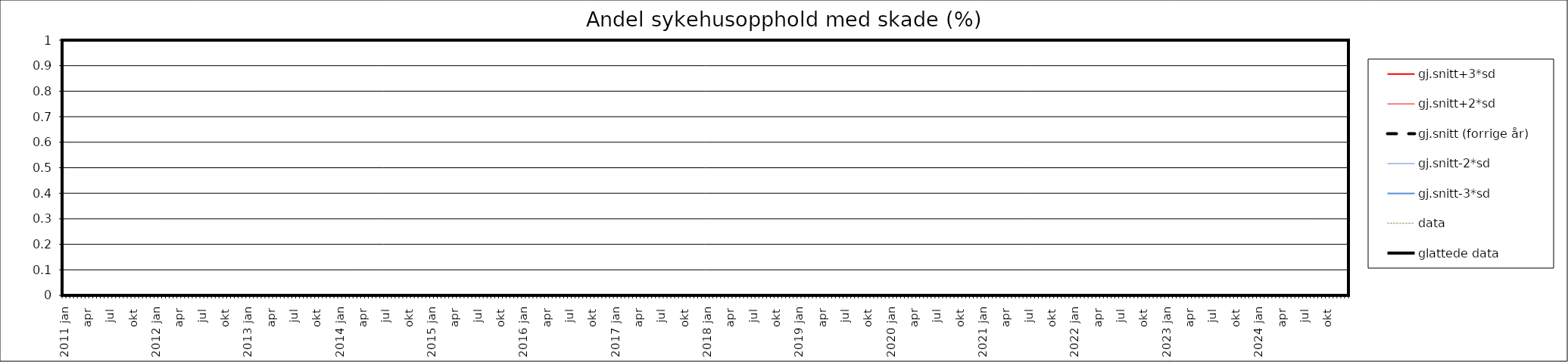
| Category | gj.snitt+3*sd | gj.snitt+2*sd | gj.snitt (forrige år) | gj.snitt-2*sd | gj.snitt-3*sd | data | glattede data |
|---|---|---|---|---|---|---|---|
| 2011 jan | 0 | 0 | 0 | 0 | 0 | 0 | 0 |
|  | 0 | 0 | 0 | 0 | 0 | 0 | 0 |
| feb | 0 | 0 | 0 | 0 | 0 | 0 | 0 |
|  | 0 | 0 | 0 | 0 | 0 | 0 | 0 |
| mar | 0 | 0 | 0 | 0 | 0 | 0 | 0 |
|  | 0 | 0 | 0 | 0 | 0 | 0 | 0 |
| apr | 0 | 0 | 0 | 0 | 0 | 0 | 0 |
|  | 0 | 0 | 0 | 0 | 0 | 0 | 0 |
| mai | 0 | 0 | 0 | 0 | 0 | 0 | 0 |
|  | 0 | 0 | 0 | 0 | 0 | 0 | 0 |
| jun | 0 | 0 | 0 | 0 | 0 | 0 | 0 |
|  | 0 | 0 | 0 | 0 | 0 | 0 | 0 |
| jul | 0 | 0 | 0 | 0 | 0 | 0 | 0 |
|  | 0 | 0 | 0 | 0 | 0 | 0 | 0 |
| aug | 0 | 0 | 0 | 0 | 0 | 0 | 0 |
|  | 0 | 0 | 0 | 0 | 0 | 0 | 0 |
| sep | 0 | 0 | 0 | 0 | 0 | 0 | 0 |
|  | 0 | 0 | 0 | 0 | 0 | 0 | 0 |
| okt | 0 | 0 | 0 | 0 | 0 | 0 | 0 |
|  | 0 | 0 | 0 | 0 | 0 | 0 | 0 |
| nov | 0 | 0 | 0 | 0 | 0 | 0 | 0 |
|  | 0 | 0 | 0 | 0 | 0 | 0 | 0 |
| des | 0 | 0 | 0 | 0 | 0 | 0 | 0 |
|  | 0 | 0 | 0 | 0 | 0 | 0 | 0 |
| 2012 jan | 0 | 0 | 0 | 0 | 0 | 0 | 0 |
|  | 0 | 0 | 0 | 0 | 0 | 0 | 0 |
| feb | 0 | 0 | 0 | 0 | 0 | 0 | 0 |
|  | 0 | 0 | 0 | 0 | 0 | 0 | 0 |
| mar | 0 | 0 | 0 | 0 | 0 | 0 | 0 |
|  | 0 | 0 | 0 | 0 | 0 | 0 | 0 |
| apr | 0 | 0 | 0 | 0 | 0 | 0 | 0 |
|  | 0 | 0 | 0 | 0 | 0 | 0 | 0 |
| mai | 0 | 0 | 0 | 0 | 0 | 0 | 0 |
|  | 0 | 0 | 0 | 0 | 0 | 0 | 0 |
| jun | 0 | 0 | 0 | 0 | 0 | 0 | 0 |
|  | 0 | 0 | 0 | 0 | 0 | 0 | 0 |
| jul | 0 | 0 | 0 | 0 | 0 | 0 | 0 |
|  | 0 | 0 | 0 | 0 | 0 | 0 | 0 |
| aug | 0 | 0 | 0 | 0 | 0 | 0 | 0 |
|  | 0 | 0 | 0 | 0 | 0 | 0 | 0 |
| sep | 0 | 0 | 0 | 0 | 0 | 0 | 0 |
|  | 0 | 0 | 0 | 0 | 0 | 0 | 0 |
| okt | 0 | 0 | 0 | 0 | 0 | 0 | 0 |
|  | 0 | 0 | 0 | 0 | 0 | 0 | 0 |
| nov | 0 | 0 | 0 | 0 | 0 | 0 | 0 |
|  | 0 | 0 | 0 | 0 | 0 | 0 | 0 |
| des | 0 | 0 | 0 | 0 | 0 | 0 | 0 |
|  | 0 | 0 | 0 | 0 | 0 | 0 | 0 |
| 2013 jan | 0 | 0 | 0 | 0 | 0 | 0 | 0 |
|  | 0 | 0 | 0 | 0 | 0 | 0 | 0 |
| feb | 0 | 0 | 0 | 0 | 0 | 0 | 0 |
|  | 0 | 0 | 0 | 0 | 0 | 0 | 0 |
| mar | 0 | 0 | 0 | 0 | 0 | 0 | 0 |
|  | 0 | 0 | 0 | 0 | 0 | 0 | 0 |
| apr | 0 | 0 | 0 | 0 | 0 | 0 | 0 |
|  | 0 | 0 | 0 | 0 | 0 | 0 | 0 |
| mai | 0 | 0 | 0 | 0 | 0 | 0 | 0 |
|  | 0 | 0 | 0 | 0 | 0 | 0 | 0 |
| jun | 0 | 0 | 0 | 0 | 0 | 0 | 0 |
|  | 0 | 0 | 0 | 0 | 0 | 0 | 0 |
| jul | 0 | 0 | 0 | 0 | 0 | 0 | 0 |
|  | 0 | 0 | 0 | 0 | 0 | 0 | 0 |
| aug | 0 | 0 | 0 | 0 | 0 | 0 | 0 |
|  | 0 | 0 | 0 | 0 | 0 | 0 | 0 |
| sep | 0 | 0 | 0 | 0 | 0 | 0 | 0 |
|  | 0 | 0 | 0 | 0 | 0 | 0 | 0 |
| okt | 0 | 0 | 0 | 0 | 0 | 0 | 0 |
|  | 0 | 0 | 0 | 0 | 0 | 0 | 0 |
| nov | 0 | 0 | 0 | 0 | 0 | 0 | 0 |
|  | 0 | 0 | 0 | 0 | 0 | 0 | 0 |
| des | 0 | 0 | 0 | 0 | 0 | 0 | 0 |
|  | 0 | 0 | 0 | 0 | 0 | 0 | 0 |
| 2014 jan | 0 | 0 | 0 | 0 | 0 | 0 | 0 |
|  | 0 | 0 | 0 | 0 | 0 | 0 | 0 |
| feb | 0 | 0 | 0 | 0 | 0 | 0 | 0 |
|  | 0 | 0 | 0 | 0 | 0 | 0 | 0 |
| mar | 0 | 0 | 0 | 0 | 0 | 0 | 0 |
|  | 0 | 0 | 0 | 0 | 0 | 0 | 0 |
| apr | 0 | 0 | 0 | 0 | 0 | 0 | 0 |
|  | 0 | 0 | 0 | 0 | 0 | 0 | 0 |
| mai | 0 | 0 | 0 | 0 | 0 | 0 | 0 |
|  | 0 | 0 | 0 | 0 | 0 | 0 | 0 |
| jun | 0 | 0 | 0 | 0 | 0 | 0 | 0 |
|  | 0 | 0 | 0 | 0 | 0 | 0 | 0 |
| jul | 0 | 0 | 0 | 0 | 0 | 0 | 0 |
|  | 0 | 0 | 0 | 0 | 0 | 0 | 0 |
| aug | 0 | 0 | 0 | 0 | 0 | 0 | 0 |
|  | 0 | 0 | 0 | 0 | 0 | 0 | 0 |
| sep | 0 | 0 | 0 | 0 | 0 | 0 | 0 |
|  | 0 | 0 | 0 | 0 | 0 | 0 | 0 |
| okt | 0 | 0 | 0 | 0 | 0 | 0 | 0 |
|  | 0 | 0 | 0 | 0 | 0 | 0 | 0 |
| nov | 0 | 0 | 0 | 0 | 0 | 0 | 0 |
|  | 0 | 0 | 0 | 0 | 0 | 0 | 0 |
| des | 0 | 0 | 0 | 0 | 0 | 0 | 0 |
|  | 0 | 0 | 0 | 0 | 0 | 0 | 0 |
| 2015 jan | 0 | 0 | 0 | 0 | 0 | 0 | 0 |
|  | 0 | 0 | 0 | 0 | 0 | 0 | 0 |
| feb | 0 | 0 | 0 | 0 | 0 | 0 | 0 |
|  | 0 | 0 | 0 | 0 | 0 | 0 | 0 |
| mar | 0 | 0 | 0 | 0 | 0 | 0 | 0 |
|  | 0 | 0 | 0 | 0 | 0 | 0 | 0 |
| apr | 0 | 0 | 0 | 0 | 0 | 0 | 0 |
|  | 0 | 0 | 0 | 0 | 0 | 0 | 0 |
| mai | 0 | 0 | 0 | 0 | 0 | 0 | 0 |
|  | 0 | 0 | 0 | 0 | 0 | 0 | 0 |
| jun | 0 | 0 | 0 | 0 | 0 | 0 | 0 |
|  | 0 | 0 | 0 | 0 | 0 | 0 | 0 |
| jul | 0 | 0 | 0 | 0 | 0 | 0 | 0 |
|  | 0 | 0 | 0 | 0 | 0 | 0 | 0 |
| aug | 0 | 0 | 0 | 0 | 0 | 0 | 0 |
|  | 0 | 0 | 0 | 0 | 0 | 0 | 0 |
| sep | 0 | 0 | 0 | 0 | 0 | 0 | 0 |
|  | 0 | 0 | 0 | 0 | 0 | 0 | 0 |
| okt | 0 | 0 | 0 | 0 | 0 | 0 | 0 |
|  | 0 | 0 | 0 | 0 | 0 | 0 | 0 |
| nov | 0 | 0 | 0 | 0 | 0 | 0 | 0 |
|  | 0 | 0 | 0 | 0 | 0 | 0 | 0 |
| des | 0 | 0 | 0 | 0 | 0 | 0 | 0 |
|  | 0 | 0 | 0 | 0 | 0 | 0 | 0 |
| 2016 jan | 0 | 0 | 0 | 0 | 0 | 0 | 0 |
|  | 0 | 0 | 0 | 0 | 0 | 0 | 0 |
| feb | 0 | 0 | 0 | 0 | 0 | 0 | 0 |
|  | 0 | 0 | 0 | 0 | 0 | 0 | 0 |
| mar | 0 | 0 | 0 | 0 | 0 | 0 | 0 |
|  | 0 | 0 | 0 | 0 | 0 | 0 | 0 |
| apr | 0 | 0 | 0 | 0 | 0 | 0 | 0 |
|  | 0 | 0 | 0 | 0 | 0 | 0 | 0 |
| mai | 0 | 0 | 0 | 0 | 0 | 0 | 0 |
|  | 0 | 0 | 0 | 0 | 0 | 0 | 0 |
| jun | 0 | 0 | 0 | 0 | 0 | 0 | 0 |
|  | 0 | 0 | 0 | 0 | 0 | 0 | 0 |
| jul | 0 | 0 | 0 | 0 | 0 | 0 | 0 |
|  | 0 | 0 | 0 | 0 | 0 | 0 | 0 |
| aug | 0 | 0 | 0 | 0 | 0 | 0 | 0 |
|  | 0 | 0 | 0 | 0 | 0 | 0 | 0 |
| sep | 0 | 0 | 0 | 0 | 0 | 0 | 0 |
|  | 0 | 0 | 0 | 0 | 0 | 0 | 0 |
| okt | 0 | 0 | 0 | 0 | 0 | 0 | 0 |
|  | 0 | 0 | 0 | 0 | 0 | 0 | 0 |
| nov | 0 | 0 | 0 | 0 | 0 | 0 | 0 |
|  | 0 | 0 | 0 | 0 | 0 | 0 | 0 |
| des | 0 | 0 | 0 | 0 | 0 | 0 | 0 |
|  | 0 | 0 | 0 | 0 | 0 | 0 | 0 |
| 2017 jan | 0 | 0 | 0 | 0 | 0 | 0 | 0 |
|  | 0 | 0 | 0 | 0 | 0 | 0 | 0 |
| feb | 0 | 0 | 0 | 0 | 0 | 0 | 0 |
|  | 0 | 0 | 0 | 0 | 0 | 0 | 0 |
| mar | 0 | 0 | 0 | 0 | 0 | 0 | 0 |
|  | 0 | 0 | 0 | 0 | 0 | 0 | 0 |
| apr | 0 | 0 | 0 | 0 | 0 | 0 | 0 |
|  | 0 | 0 | 0 | 0 | 0 | 0 | 0 |
| mai | 0 | 0 | 0 | 0 | 0 | 0 | 0 |
|  | 0 | 0 | 0 | 0 | 0 | 0 | 0 |
| jun | 0 | 0 | 0 | 0 | 0 | 0 | 0 |
|  | 0 | 0 | 0 | 0 | 0 | 0 | 0 |
| jul | 0 | 0 | 0 | 0 | 0 | 0 | 0 |
|  | 0 | 0 | 0 | 0 | 0 | 0 | 0 |
| aug | 0 | 0 | 0 | 0 | 0 | 0 | 0 |
|  | 0 | 0 | 0 | 0 | 0 | 0 | 0 |
| sep | 0 | 0 | 0 | 0 | 0 | 0 | 0 |
|  | 0 | 0 | 0 | 0 | 0 | 0 | 0 |
| okt | 0 | 0 | 0 | 0 | 0 | 0 | 0 |
|  | 0 | 0 | 0 | 0 | 0 | 0 | 0 |
| nov | 0 | 0 | 0 | 0 | 0 | 0 | 0 |
|  | 0 | 0 | 0 | 0 | 0 | 0 | 0 |
| des | 0 | 0 | 0 | 0 | 0 | 0 | 0 |
|  | 0 | 0 | 0 | 0 | 0 | 0 | 0 |
| 2018 jan | 0 | 0 | 0 | 0 | 0 | 0 | 0 |
|  | 0 | 0 | 0 | 0 | 0 | 0 | 0 |
| feb | 0 | 0 | 0 | 0 | 0 | 0 | 0 |
|  | 0 | 0 | 0 | 0 | 0 | 0 | 0 |
| mar | 0 | 0 | 0 | 0 | 0 | 0 | 0 |
|  | 0 | 0 | 0 | 0 | 0 | 0 | 0 |
| apr | 0 | 0 | 0 | 0 | 0 | 0 | 0 |
|  | 0 | 0 | 0 | 0 | 0 | 0 | 0 |
| mai | 0 | 0 | 0 | 0 | 0 | 0 | 0 |
|  | 0 | 0 | 0 | 0 | 0 | 0 | 0 |
| jun | 0 | 0 | 0 | 0 | 0 | 0 | 0 |
|  | 0 | 0 | 0 | 0 | 0 | 0 | 0 |
| jul | 0 | 0 | 0 | 0 | 0 | 0 | 0 |
|  | 0 | 0 | 0 | 0 | 0 | 0 | 0 |
| aug | 0 | 0 | 0 | 0 | 0 | 0 | 0 |
|  | 0 | 0 | 0 | 0 | 0 | 0 | 0 |
| sep | 0 | 0 | 0 | 0 | 0 | 0 | 0 |
|  | 0 | 0 | 0 | 0 | 0 | 0 | 0 |
| okt | 0 | 0 | 0 | 0 | 0 | 0 | 0 |
|  | 0 | 0 | 0 | 0 | 0 | 0 | 0 |
| nov | 0 | 0 | 0 | 0 | 0 | 0 | 0 |
|  | 0 | 0 | 0 | 0 | 0 | 0 | 0 |
| des | 0 | 0 | 0 | 0 | 0 | 0 | 0 |
|  | 0 | 0 | 0 | 0 | 0 | 0 | 0 |
| 2019 jan | 0 | 0 | 0 | 0 | 0 | 0 | 0 |
|  | 0 | 0 | 0 | 0 | 0 | 0 | 0 |
| feb | 0 | 0 | 0 | 0 | 0 | 0 | 0 |
|  | 0 | 0 | 0 | 0 | 0 | 0 | 0 |
| mar | 0 | 0 | 0 | 0 | 0 | 0 | 0 |
|  | 0 | 0 | 0 | 0 | 0 | 0 | 0 |
| apr | 0 | 0 | 0 | 0 | 0 | 0 | 0 |
|  | 0 | 0 | 0 | 0 | 0 | 0 | 0 |
| mai | 0 | 0 | 0 | 0 | 0 | 0 | 0 |
|  | 0 | 0 | 0 | 0 | 0 | 0 | 0 |
| jun | 0 | 0 | 0 | 0 | 0 | 0 | 0 |
|  | 0 | 0 | 0 | 0 | 0 | 0 | 0 |
| jul | 0 | 0 | 0 | 0 | 0 | 0 | 0 |
|  | 0 | 0 | 0 | 0 | 0 | 0 | 0 |
| aug | 0 | 0 | 0 | 0 | 0 | 0 | 0 |
|  | 0 | 0 | 0 | 0 | 0 | 0 | 0 |
| sep | 0 | 0 | 0 | 0 | 0 | 0 | 0 |
|  | 0 | 0 | 0 | 0 | 0 | 0 | 0 |
| okt | 0 | 0 | 0 | 0 | 0 | 0 | 0 |
|  | 0 | 0 | 0 | 0 | 0 | 0 | 0 |
| nov | 0 | 0 | 0 | 0 | 0 | 0 | 0 |
|  | 0 | 0 | 0 | 0 | 0 | 0 | 0 |
| des | 0 | 0 | 0 | 0 | 0 | 0 | 0 |
|  | 0 | 0 | 0 | 0 | 0 | 0 | 0 |
| 2020 jan | 0 | 0 | 0 | 0 | 0 | 0 | 0 |
|  | 0 | 0 | 0 | 0 | 0 | 0 | 0 |
| feb | 0 | 0 | 0 | 0 | 0 | 0 | 0 |
|  | 0 | 0 | 0 | 0 | 0 | 0 | 0 |
| mar | 0 | 0 | 0 | 0 | 0 | 0 | 0 |
|  | 0 | 0 | 0 | 0 | 0 | 0 | 0 |
| apr | 0 | 0 | 0 | 0 | 0 | 0 | 0 |
|  | 0 | 0 | 0 | 0 | 0 | 0 | 0 |
| mai | 0 | 0 | 0 | 0 | 0 | 0 | 0 |
|  | 0 | 0 | 0 | 0 | 0 | 0 | 0 |
| jun | 0 | 0 | 0 | 0 | 0 | 0 | 0 |
|  | 0 | 0 | 0 | 0 | 0 | 0 | 0 |
| jul | 0 | 0 | 0 | 0 | 0 | 0 | 0 |
|  | 0 | 0 | 0 | 0 | 0 | 0 | 0 |
| aug | 0 | 0 | 0 | 0 | 0 | 0 | 0 |
|  | 0 | 0 | 0 | 0 | 0 | 0 | 0 |
| sep | 0 | 0 | 0 | 0 | 0 | 0 | 0 |
|  | 0 | 0 | 0 | 0 | 0 | 0 | 0 |
| okt | 0 | 0 | 0 | 0 | 0 | 0 | 0 |
|  | 0 | 0 | 0 | 0 | 0 | 0 | 0 |
| nov | 0 | 0 | 0 | 0 | 0 | 0 | 0 |
|  | 0 | 0 | 0 | 0 | 0 | 0 | 0 |
| des | 0 | 0 | 0 | 0 | 0 | 0 | 0 |
|  | 0 | 0 | 0 | 0 | 0 | 0 | 0 |
| 2021 jan | 0 | 0 | 0 | 0 | 0 | 0 | 0 |
|  | 0 | 0 | 0 | 0 | 0 | 0 | 0 |
| feb | 0 | 0 | 0 | 0 | 0 | 0 | 0 |
|  | 0 | 0 | 0 | 0 | 0 | 0 | 0 |
| mar | 0 | 0 | 0 | 0 | 0 | 0 | 0 |
|  | 0 | 0 | 0 | 0 | 0 | 0 | 0 |
| apr | 0 | 0 | 0 | 0 | 0 | 0 | 0 |
|  | 0 | 0 | 0 | 0 | 0 | 0 | 0 |
| mai | 0 | 0 | 0 | 0 | 0 | 0 | 0 |
|  | 0 | 0 | 0 | 0 | 0 | 0 | 0 |
| jun | 0 | 0 | 0 | 0 | 0 | 0 | 0 |
|  | 0 | 0 | 0 | 0 | 0 | 0 | 0 |
| jul | 0 | 0 | 0 | 0 | 0 | 0 | 0 |
|  | 0 | 0 | 0 | 0 | 0 | 0 | 0 |
| aug | 0 | 0 | 0 | 0 | 0 | 0 | 0 |
|  | 0 | 0 | 0 | 0 | 0 | 0 | 0 |
| sep | 0 | 0 | 0 | 0 | 0 | 0 | 0 |
|  | 0 | 0 | 0 | 0 | 0 | 0 | 0 |
| okt | 0 | 0 | 0 | 0 | 0 | 0 | 0 |
|  | 0 | 0 | 0 | 0 | 0 | 0 | 0 |
| nov | 0 | 0 | 0 | 0 | 0 | 0 | 0 |
|  | 0 | 0 | 0 | 0 | 0 | 0 | 0 |
| des | 0 | 0 | 0 | 0 | 0 | 0 | 0 |
|  | 0 | 0 | 0 | 0 | 0 | 0 | 0 |
| 2022 jan | 0 | 0 | 0 | 0 | 0 | 0 | 0 |
|  | 0 | 0 | 0 | 0 | 0 | 0 | 0 |
| feb | 0 | 0 | 0 | 0 | 0 | 0 | 0 |
|  | 0 | 0 | 0 | 0 | 0 | 0 | 0 |
| mar | 0 | 0 | 0 | 0 | 0 | 0 | 0 |
|  | 0 | 0 | 0 | 0 | 0 | 0 | 0 |
| apr | 0 | 0 | 0 | 0 | 0 | 0 | 0 |
|  | 0 | 0 | 0 | 0 | 0 | 0 | 0 |
| mai | 0 | 0 | 0 | 0 | 0 | 0 | 0 |
|  | 0 | 0 | 0 | 0 | 0 | 0 | 0 |
| jun | 0 | 0 | 0 | 0 | 0 | 0 | 0 |
|  | 0 | 0 | 0 | 0 | 0 | 0 | 0 |
| jul | 0 | 0 | 0 | 0 | 0 | 0 | 0 |
|  | 0 | 0 | 0 | 0 | 0 | 0 | 0 |
| aug | 0 | 0 | 0 | 0 | 0 | 0 | 0 |
|  | 0 | 0 | 0 | 0 | 0 | 0 | 0 |
| sep | 0 | 0 | 0 | 0 | 0 | 0 | 0 |
|  | 0 | 0 | 0 | 0 | 0 | 0 | 0 |
| okt | 0 | 0 | 0 | 0 | 0 | 0 | 0 |
|  | 0 | 0 | 0 | 0 | 0 | 0 | 0 |
| nov | 0 | 0 | 0 | 0 | 0 | 0 | 0 |
|  | 0 | 0 | 0 | 0 | 0 | 0 | 0 |
| des | 0 | 0 | 0 | 0 | 0 | 0 | 0 |
|  | 0 | 0 | 0 | 0 | 0 | 0 | 0 |
| 2023 jan | 0 | 0 | 0 | 0 | 0 | 0 | 0 |
|  | 0 | 0 | 0 | 0 | 0 | 0 | 0 |
| feb | 0 | 0 | 0 | 0 | 0 | 0 | 0 |
|  | 0 | 0 | 0 | 0 | 0 | 0 | 0 |
| mar | 0 | 0 | 0 | 0 | 0 | 0 | 0 |
|  | 0 | 0 | 0 | 0 | 0 | 0 | 0 |
| apr | 0 | 0 | 0 | 0 | 0 | 0 | 0 |
|  | 0 | 0 | 0 | 0 | 0 | 0 | 0 |
| mai | 0 | 0 | 0 | 0 | 0 | 0 | 0 |
|  | 0 | 0 | 0 | 0 | 0 | 0 | 0 |
| jun | 0 | 0 | 0 | 0 | 0 | 0 | 0 |
|  | 0 | 0 | 0 | 0 | 0 | 0 | 0 |
| jul | 0 | 0 | 0 | 0 | 0 | 0 | 0 |
|  | 0 | 0 | 0 | 0 | 0 | 0 | 0 |
| aug | 0 | 0 | 0 | 0 | 0 | 0 | 0 |
|  | 0 | 0 | 0 | 0 | 0 | 0 | 0 |
| sep | 0 | 0 | 0 | 0 | 0 | 0 | 0 |
|  | 0 | 0 | 0 | 0 | 0 | 0 | 0 |
| okt | 0 | 0 | 0 | 0 | 0 | 0 | 0 |
|  | 0 | 0 | 0 | 0 | 0 | 0 | 0 |
| nov | 0 | 0 | 0 | 0 | 0 | 0 | 0 |
|  | 0 | 0 | 0 | 0 | 0 | 0 | 0 |
| des | 0 | 0 | 0 | 0 | 0 | 0 | 0 |
|  | 0 | 0 | 0 | 0 | 0 | 0 | 0 |
| 2024 jan | 0 | 0 | 0 | 0 | 0 | 0 | 0 |
|  | 0 | 0 | 0 | 0 | 0 | 0 | 0 |
| feb | 0 | 0 | 0 | 0 | 0 | 0 | 0 |
|  | 0 | 0 | 0 | 0 | 0 | 0 | 0 |
| mar | 0 | 0 | 0 | 0 | 0 | 0 | 0 |
|  | 0 | 0 | 0 | 0 | 0 | 0 | 0 |
| apr | 0 | 0 | 0 | 0 | 0 | 0 | 0 |
|  | 0 | 0 | 0 | 0 | 0 | 0 | 0 |
| mai | 0 | 0 | 0 | 0 | 0 | 0 | 0 |
|  | 0 | 0 | 0 | 0 | 0 | 0 | 0 |
| jun | 0 | 0 | 0 | 0 | 0 | 0 | 0 |
|  | 0 | 0 | 0 | 0 | 0 | 0 | 0 |
| jul | 0 | 0 | 0 | 0 | 0 | 0 | 0 |
|  | 0 | 0 | 0 | 0 | 0 | 0 | 0 |
| aug | 0 | 0 | 0 | 0 | 0 | 0 | 0 |
|  | 0 | 0 | 0 | 0 | 0 | 0 | 0 |
| sep | 0 | 0 | 0 | 0 | 0 | 0 | 0 |
|  | 0 | 0 | 0 | 0 | 0 | 0 | 0 |
| okt | 0 | 0 | 0 | 0 | 0 | 0 | 0 |
|  | 0 | 0 | 0 | 0 | 0 | 0 | 0 |
| nov | 0 | 0 | 0 | 0 | 0 | 0 | 0 |
|  | 0 | 0 | 0 | 0 | 0 | 0 | 0 |
| des | 0 | 0 | 0 | 0 | 0 | 0 | 0 |